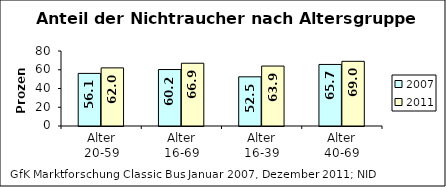
| Category | 2007 | 2011 |
|---|---|---|
| Alter
20-59 | 56.107 | 61.984 |
| Alter
16-69 | 60.227 | 66.95 |
| Alter
16-39 | 52.464 | 63.946 |
| Alter
40-69 | 65.653 | 68.985 |